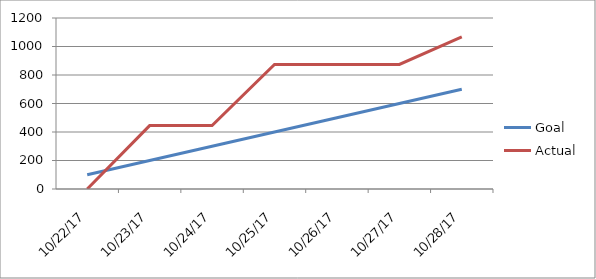
| Category | Goal | Actual |
|---|---|---|
| 2017-10-22 | 100 | 0 |
| 2017-10-23 | 200 | 445 |
| 2017-10-24 | 300 | 445 |
| 2017-10-25 | 400 | 874 |
| 2017-10-26 | 500 | 874 |
| 2017-10-27 | 600 | 874 |
| 2017-10-28 | 700 | 1067 |